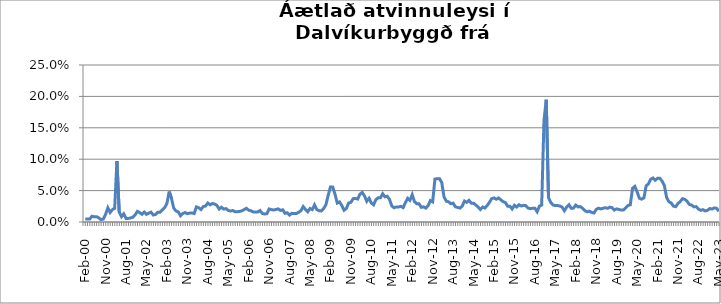
| Category | Series 0 |
|---|---|
| feb.00 | 0.005 |
| mar.00 | 0.005 |
| apr.00 | 0.005 |
| maí.00 | 0.009 |
| jún.00 | 0.008 |
| júl.00 | 0.008 |
| ágú.00 | 0.007 |
| sep.00 | 0.004 |
| okt.00 | 0.005 |
| nóv.00 | 0.012 |
| des.00 | 0.023 |
| jan.01 | 0.015 |
| feb.01 | 0.02 |
| mar.01 | 0.022 |
| apr.01 | 0.097 |
| maí.01 | 0.016 |
| jún.01 | 0.008 |
| júl.01 | 0.013 |
| ágú.01 | 0.006 |
| sep.01 | 0.006 |
| okt.01 | 0.007 |
| nóv.01 | 0.007 |
| des.01 | 0.011 |
| jan.02 | 0.017 |
| feb.02 | 0.015 |
| mar.02 | 0.012 |
| apr.02 | 0.016 |
| maí.02 | 0.012 |
| jún.02 | 0.014 |
| júl.02 | 0.016 |
| ágú.02 | 0.011 |
| sep.02 | 0.012 |
| okt.02 | 0.016 |
| nóv.02 | 0.016 |
| des.02 | 0.019 |
| jan.03 | 0.023 |
| feb.03 | 0.029 |
| mar.03 | 0.049 |
| apr.03 | 0.038 |
| maí.03 | 0.022 |
| jún.03 | 0.018 |
| júl.03 | 0.016 |
| ágú.03 | 0.01 |
| sep.03 | 0.013 |
| okt.03 | 0.015 |
| nóv.03 | 0.013 |
| des.03 | 0.014 |
| jan.04 | 0.014 |
| feb.04 | 0.013 |
| mar.04 | 0.024 |
| apr.04 | 0.023 |
| maí.04 | 0.02 |
| jún.04 | 0.025 |
| júl.04 | 0.025 |
| ágú.04 | 0.03 |
| sep.04 | 0.027 |
| okt.04 | 0.03 |
| nóv.04 | 0.029 |
| des.04 | 0.027 |
| jan.05 | 0.021 |
| feb.05 | 0.024 |
| mar.05 | 0.021 |
| apr.05 | 0.021 |
| maí.05 | 0.018 |
| jún.05 | 0.017 |
| júl.05 | 0.018 |
| ágú.05 | 0.016 |
| sep.05 | 0.016 |
| okt.05 | 0.017 |
| nóv.05 | 0.018 |
| des.05 | 0.02 |
| jan.06 | 0.022 |
| feb.06 | 0.019 |
| mar.06 | 0.018 |
| apr.06 | 0.016 |
| maí.06 | 0.016 |
| jún.06 | 0.016 |
| júl.06 | 0.018 |
| ágú.06 | 0.014 |
| sep.06 | 0.013 |
| okt.06 | 0.013 |
| nóv.06 | 0.021 |
| des.06 | 0.02 |
| jan.07 | 0.019 |
| feb.07 | 0.02 |
| mar.07 | 0.021 |
| apr.07 | 0.018 |
| maí.07 | 0.019 |
| jún.07 | 0.014 |
| júl.07 | 0.015 |
| ágú.07 | 0.011 |
| sep.07 | 0.014 |
| okt.07 | 0.013 |
| nóv.07 | 0.013 |
| des.07 | 0.015 |
| jan.08 | 0.018 |
| feb.08 | 0.025 |
| mar.08 | 0.02 |
| apr.08 | 0.016 |
| maí.08 | 0.022 |
| jún.08 | 0.02 |
| júl.08 | 0.027 |
| ágú.08 | 0.02 |
| sep.08 | 0.018 |
| okt.08 | 0.018 |
| nóv.08 | 0.022 |
| des.08 | 0.027 |
| jan.09 | 0.043 |
| feb.09 | 0.056 |
| mar.09 | 0.056 |
| apr.09 | 0.044 |
| maí.09 | 0.03 |
| jún.09 | 0.032 |
| júl.09 | 0.026 |
| ágú.09 | 0.019 |
| sep.09 | 0.022 |
| okt.09 | 0.03 |
| nóv.09 | 0.031 |
| des.09 | 0.037 |
| jan.10 | 0.038 |
| feb.10 | 0.037 |
| mar.10 | 0.044 |
| apr.10 | 0.047 |
| maí.10 | 0.041 |
| jún.10 | 0.033 |
| júl.10 | 0.038 |
| ágú.10 | 0.03 |
| sep.10 | 0.027 |
| okt.10 | 0.036 |
| nóv.10 | 0.038 |
| des.10 | 0.038 |
| jan.11 | 0.045 |
| feb.11 | 0.04 |
| mar.11 | 0.041 |
| apr.11 | 0.036 |
| maí.11 | 0.026 |
| jún.11 | 0.023 |
| júl.11 | 0.024 |
| ágú.11 | 0.024 |
| sep.11 | 0.025 |
| okt.11 | 0.023 |
| nóv.11 | 0.031 |
| des.11 | 0.038 |
| jan.12 | 0.034 |
| feb.12 | 0.044 |
| mar.12 | 0.032 |
| apr.12 | 0.029 |
| maí.12 | 0.029 |
| jún.12 | 0.023 |
| júl.12 | 0.024 |
| ágú.12 | 0.022 |
| sep.12 | 0.026 |
| okt.12 | 0.034 |
| nóv.12 | 0.032 |
| des.12 | 0.068 |
| jan.13 | 0.069 |
| feb.13 | 0.069 |
| mar.13 | 0.063 |
| apr.13 | 0.04 |
| maí.13 | 0.033 |
| jún.13 | 0.032 |
| júl.13 | 0.029 |
| ágú.13 | 0.03 |
| sep.13 | 0.024 |
| okt.13 | 0.023 |
| nóv.13 | 0.022 |
| des.13 | 0.025 |
| jan.14 | 0.033 |
| feb.14 | 0.031 |
| mar.14 | 0.034 |
| apr.14 | 0.03 |
| maí.14 | 0.03 |
| jún.14 | 0.027 |
| júl.14 | 0.024 |
| ágú.14 | 0.02 |
| sep.14 | 0.024 |
| okt.14 | 0.022 |
| nóv.14 | 0.026 |
| des.14 | 0.031 |
| jan.15 | 0.037 |
| feb.15 | 0.038 |
| mar.15 | 0.036 |
| apr.15 | 0.038 |
| maí.15 | 0.035 |
| jún.15 | 0.032 |
| júl.15 | 0.031 |
| ágú.15 | 0.025 |
| sep.15 | 0.025 |
| okt.15 | 0.021 |
| nóv.15 | 0.027 |
| des.15 | 0.024 |
| jan.16 | 0.028 |
| feb.16 | 0.026 |
| mar.16 | 0.027 |
| apr.16 | 0.026 |
| maí.16 | 0.022 |
| jún.16 | 0.021 |
| júl.16 | 0.022 |
| ágú.16 | 0.022 |
| sep.16 | 0.016 |
| okt.16 | 0.025 |
| nóv.16 | 0.027 |
| des.16 | 0.161 |
| jan.17 | 0.195 |
| feb.17 | 0.039 |
| mar.17 | 0.031 |
| apr.17 | 0.027 |
| maí.17 | 0.026 |
| jún.17 | 0.026 |
| júl.17 | 0.025 |
| ágú.17 | 0.024 |
| sep.17 | 0.018 |
| okt.17 | 0.024 |
| nóv.17 | 0.028 |
| des.17 | 0.022 |
| jan.18 | 0.022 |
| feb.18 | 0.027 |
| mar.18 | 0.024 |
| apr.18 | 0.025 |
| maí.18 | 0.022 |
| jún.18 | 0.018 |
| júl.18 | 0.016 |
| ágú.18 | 0.017 |
| sep.18 | 0.015 |
| okt.18 | 0.014 |
| nóv.18 | 0.02 |
| des.18 | 0.022 |
| jan.19 | 0.021 |
| feb.19 | 0.022 |
| mar.19 | 0.023 |
| apr.19 | 0.022 |
| maí.19 | 0.024 |
| jún.19 | 0.023 |
| júl.19 | 0.019 |
| ágú.19 | 0.021 |
| sep.19 | 0.02 |
| okt.19 | 0.019 |
| nóv.19 | 0.019 |
| des.19 | 0.023 |
| jan.20 | 0.026 |
| feb.20 | 0.027 |
| mar.2020* | 0.054 |
| apr.20 | 0.057 |
| maí.20 | 0.048 |
| jún.20 | 0.038 |
| júl.20 | 0.036 |
| ágú.20 | 0.038 |
| sep.20 | 0.058 |
| okt.20 | 0.061 |
| nóv.20 | 0.068 |
| des.20 | 0.07 |
| jan.21 | 0.067 |
| feb.21 | 0.07 |
| mar.21 | 0.07 |
| apr.21 | 0.065 |
| maí.21 | 0.058 |
| jún.21 | 0.039 |
| júl.21 | 0.032 |
| ágú.21 | 0.03 |
| sep.21 | 0.025 |
| okt.21 | 0.024 |
| nóv.21 | 0.029 |
| des.21 | 0.033 |
| jan.22 | 0.037 |
| feb.22 | 0.036 |
| mar.22 | 0.033 |
| apr.22 | 0.028 |
| maí.22 | 0.027 |
| jún.22 | 0.024 |
| júl.22 | 0.024 |
| ágú.22 | 0.021 |
| sep.22 | 0.019 |
| okt.22 | 0.02 |
| nóv.22 | 0.018 |
| des.22 | 0.019 |
| jan.23 | 0.022 |
| feb.23 | 0.021 |
| mar.23 | 0.023 |
| apr.23 | 0.022 |
| maí.23 | 0.017 |